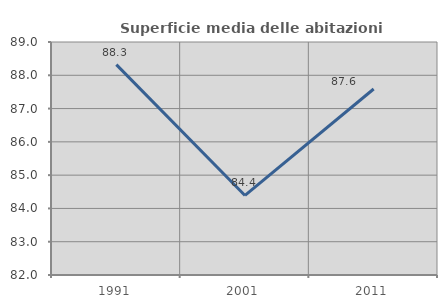
| Category | Superficie media delle abitazioni occupate |
|---|---|
| 1991.0 | 88.32 |
| 2001.0 | 84.39 |
| 2011.0 | 87.587 |